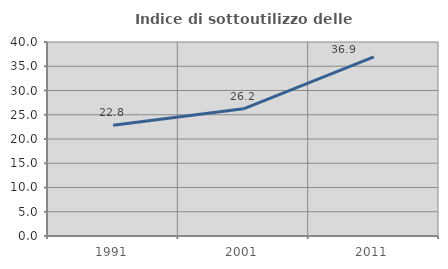
| Category | Indice di sottoutilizzo delle abitazioni  |
|---|---|
| 1991.0 | 22.836 |
| 2001.0 | 26.233 |
| 2011.0 | 36.915 |